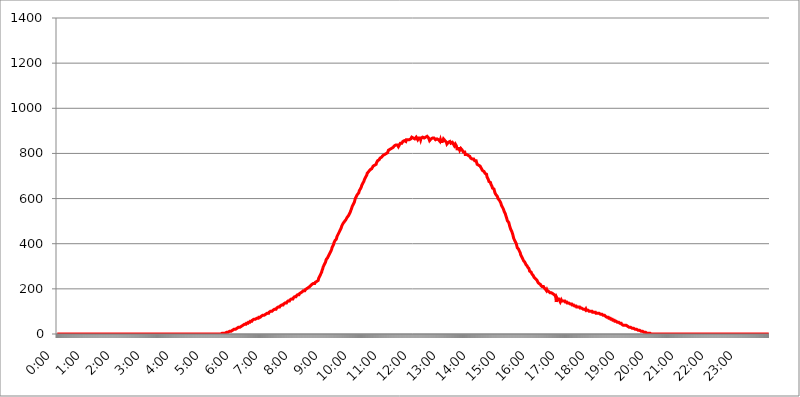
| Category | 2017.08.09. Intenzitás [W/m^2] |
|---|---|
| 0.0 | 0 |
| 0.0006944444444444445 | 0 |
| 0.001388888888888889 | 0 |
| 0.0020833333333333333 | 0 |
| 0.002777777777777778 | 0 |
| 0.003472222222222222 | 0 |
| 0.004166666666666667 | 0 |
| 0.004861111111111111 | 0 |
| 0.005555555555555556 | 0 |
| 0.0062499999999999995 | 0 |
| 0.006944444444444444 | 0 |
| 0.007638888888888889 | 0 |
| 0.008333333333333333 | 0 |
| 0.009027777777777779 | 0 |
| 0.009722222222222222 | 0 |
| 0.010416666666666666 | 0 |
| 0.011111111111111112 | 0 |
| 0.011805555555555555 | 0 |
| 0.012499999999999999 | 0 |
| 0.013194444444444444 | 0 |
| 0.013888888888888888 | 0 |
| 0.014583333333333332 | 0 |
| 0.015277777777777777 | 0 |
| 0.015972222222222224 | 0 |
| 0.016666666666666666 | 0 |
| 0.017361111111111112 | 0 |
| 0.018055555555555557 | 0 |
| 0.01875 | 0 |
| 0.019444444444444445 | 0 |
| 0.02013888888888889 | 0 |
| 0.020833333333333332 | 0 |
| 0.02152777777777778 | 0 |
| 0.022222222222222223 | 0 |
| 0.02291666666666667 | 0 |
| 0.02361111111111111 | 0 |
| 0.024305555555555556 | 0 |
| 0.024999999999999998 | 0 |
| 0.025694444444444447 | 0 |
| 0.02638888888888889 | 0 |
| 0.027083333333333334 | 0 |
| 0.027777777777777776 | 0 |
| 0.02847222222222222 | 0 |
| 0.029166666666666664 | 0 |
| 0.029861111111111113 | 0 |
| 0.030555555555555555 | 0 |
| 0.03125 | 0 |
| 0.03194444444444445 | 0 |
| 0.03263888888888889 | 0 |
| 0.03333333333333333 | 0 |
| 0.034027777777777775 | 0 |
| 0.034722222222222224 | 0 |
| 0.035416666666666666 | 0 |
| 0.036111111111111115 | 0 |
| 0.03680555555555556 | 0 |
| 0.0375 | 0 |
| 0.03819444444444444 | 0 |
| 0.03888888888888889 | 0 |
| 0.03958333333333333 | 0 |
| 0.04027777777777778 | 0 |
| 0.04097222222222222 | 0 |
| 0.041666666666666664 | 0 |
| 0.042361111111111106 | 0 |
| 0.04305555555555556 | 0 |
| 0.043750000000000004 | 0 |
| 0.044444444444444446 | 0 |
| 0.04513888888888889 | 0 |
| 0.04583333333333334 | 0 |
| 0.04652777777777778 | 0 |
| 0.04722222222222222 | 0 |
| 0.04791666666666666 | 0 |
| 0.04861111111111111 | 0 |
| 0.049305555555555554 | 0 |
| 0.049999999999999996 | 0 |
| 0.05069444444444445 | 0 |
| 0.051388888888888894 | 0 |
| 0.052083333333333336 | 0 |
| 0.05277777777777778 | 0 |
| 0.05347222222222222 | 0 |
| 0.05416666666666667 | 0 |
| 0.05486111111111111 | 0 |
| 0.05555555555555555 | 0 |
| 0.05625 | 0 |
| 0.05694444444444444 | 0 |
| 0.057638888888888885 | 0 |
| 0.05833333333333333 | 0 |
| 0.05902777777777778 | 0 |
| 0.059722222222222225 | 0 |
| 0.06041666666666667 | 0 |
| 0.061111111111111116 | 0 |
| 0.06180555555555556 | 0 |
| 0.0625 | 0 |
| 0.06319444444444444 | 0 |
| 0.06388888888888888 | 0 |
| 0.06458333333333334 | 0 |
| 0.06527777777777778 | 0 |
| 0.06597222222222222 | 0 |
| 0.06666666666666667 | 0 |
| 0.06736111111111111 | 0 |
| 0.06805555555555555 | 0 |
| 0.06874999999999999 | 0 |
| 0.06944444444444443 | 0 |
| 0.07013888888888889 | 0 |
| 0.07083333333333333 | 0 |
| 0.07152777777777779 | 0 |
| 0.07222222222222223 | 0 |
| 0.07291666666666667 | 0 |
| 0.07361111111111111 | 0 |
| 0.07430555555555556 | 0 |
| 0.075 | 0 |
| 0.07569444444444444 | 0 |
| 0.0763888888888889 | 0 |
| 0.07708333333333334 | 0 |
| 0.07777777777777778 | 0 |
| 0.07847222222222222 | 0 |
| 0.07916666666666666 | 0 |
| 0.0798611111111111 | 0 |
| 0.08055555555555556 | 0 |
| 0.08125 | 0 |
| 0.08194444444444444 | 0 |
| 0.08263888888888889 | 0 |
| 0.08333333333333333 | 0 |
| 0.08402777777777777 | 0 |
| 0.08472222222222221 | 0 |
| 0.08541666666666665 | 0 |
| 0.08611111111111112 | 0 |
| 0.08680555555555557 | 0 |
| 0.08750000000000001 | 0 |
| 0.08819444444444445 | 0 |
| 0.08888888888888889 | 0 |
| 0.08958333333333333 | 0 |
| 0.09027777777777778 | 0 |
| 0.09097222222222222 | 0 |
| 0.09166666666666667 | 0 |
| 0.09236111111111112 | 0 |
| 0.09305555555555556 | 0 |
| 0.09375 | 0 |
| 0.09444444444444444 | 0 |
| 0.09513888888888888 | 0 |
| 0.09583333333333333 | 0 |
| 0.09652777777777777 | 0 |
| 0.09722222222222222 | 0 |
| 0.09791666666666667 | 0 |
| 0.09861111111111111 | 0 |
| 0.09930555555555555 | 0 |
| 0.09999999999999999 | 0 |
| 0.10069444444444443 | 0 |
| 0.1013888888888889 | 0 |
| 0.10208333333333335 | 0 |
| 0.10277777777777779 | 0 |
| 0.10347222222222223 | 0 |
| 0.10416666666666667 | 0 |
| 0.10486111111111111 | 0 |
| 0.10555555555555556 | 0 |
| 0.10625 | 0 |
| 0.10694444444444444 | 0 |
| 0.1076388888888889 | 0 |
| 0.10833333333333334 | 0 |
| 0.10902777777777778 | 0 |
| 0.10972222222222222 | 0 |
| 0.1111111111111111 | 0 |
| 0.11180555555555556 | 0 |
| 0.11180555555555556 | 0 |
| 0.1125 | 0 |
| 0.11319444444444444 | 0 |
| 0.11388888888888889 | 0 |
| 0.11458333333333333 | 0 |
| 0.11527777777777777 | 0 |
| 0.11597222222222221 | 0 |
| 0.11666666666666665 | 0 |
| 0.1173611111111111 | 0 |
| 0.11805555555555557 | 0 |
| 0.11944444444444445 | 0 |
| 0.12013888888888889 | 0 |
| 0.12083333333333333 | 0 |
| 0.12152777777777778 | 0 |
| 0.12222222222222223 | 0 |
| 0.12291666666666667 | 0 |
| 0.12291666666666667 | 0 |
| 0.12361111111111112 | 0 |
| 0.12430555555555556 | 0 |
| 0.125 | 0 |
| 0.12569444444444444 | 0 |
| 0.12638888888888888 | 0 |
| 0.12708333333333333 | 0 |
| 0.16875 | 0 |
| 0.12847222222222224 | 0 |
| 0.12916666666666668 | 0 |
| 0.12986111111111112 | 0 |
| 0.13055555555555556 | 0 |
| 0.13125 | 0 |
| 0.13194444444444445 | 0 |
| 0.1326388888888889 | 0 |
| 0.13333333333333333 | 0 |
| 0.13402777777777777 | 0 |
| 0.13402777777777777 | 0 |
| 0.13472222222222222 | 0 |
| 0.13541666666666666 | 0 |
| 0.1361111111111111 | 0 |
| 0.13749999999999998 | 0 |
| 0.13819444444444443 | 0 |
| 0.1388888888888889 | 0 |
| 0.13958333333333334 | 0 |
| 0.14027777777777778 | 0 |
| 0.14097222222222222 | 0 |
| 0.14166666666666666 | 0 |
| 0.1423611111111111 | 0 |
| 0.14305555555555557 | 0 |
| 0.14375000000000002 | 0 |
| 0.14444444444444446 | 0 |
| 0.1451388888888889 | 0 |
| 0.1451388888888889 | 0 |
| 0.14652777777777778 | 0 |
| 0.14722222222222223 | 0 |
| 0.14791666666666667 | 0 |
| 0.1486111111111111 | 0 |
| 0.14930555555555555 | 0 |
| 0.15 | 0 |
| 0.15069444444444444 | 0 |
| 0.15138888888888888 | 0 |
| 0.15208333333333332 | 0 |
| 0.15277777777777776 | 0 |
| 0.15347222222222223 | 0 |
| 0.15416666666666667 | 0 |
| 0.15486111111111112 | 0 |
| 0.15555555555555556 | 0 |
| 0.15625 | 0 |
| 0.15694444444444444 | 0 |
| 0.15763888888888888 | 0 |
| 0.15833333333333333 | 0 |
| 0.15902777777777777 | 0 |
| 0.15972222222222224 | 0 |
| 0.16041666666666668 | 0 |
| 0.16111111111111112 | 0 |
| 0.16180555555555556 | 0 |
| 0.1625 | 0 |
| 0.16319444444444445 | 0 |
| 0.1638888888888889 | 0 |
| 0.16458333333333333 | 0 |
| 0.16527777777777777 | 0 |
| 0.16597222222222222 | 0 |
| 0.16666666666666666 | 0 |
| 0.1673611111111111 | 0 |
| 0.16805555555555554 | 0 |
| 0.16874999999999998 | 0 |
| 0.16944444444444443 | 0 |
| 0.17013888888888887 | 0 |
| 0.1708333333333333 | 0 |
| 0.17152777777777775 | 0 |
| 0.17222222222222225 | 0 |
| 0.1729166666666667 | 0 |
| 0.17361111111111113 | 0 |
| 0.17430555555555557 | 0 |
| 0.17500000000000002 | 0 |
| 0.17569444444444446 | 0 |
| 0.1763888888888889 | 0 |
| 0.17708333333333334 | 0 |
| 0.17777777777777778 | 0 |
| 0.17847222222222223 | 0 |
| 0.17916666666666667 | 0 |
| 0.1798611111111111 | 0 |
| 0.18055555555555555 | 0 |
| 0.18125 | 0 |
| 0.18194444444444444 | 0 |
| 0.1826388888888889 | 0 |
| 0.18333333333333335 | 0 |
| 0.1840277777777778 | 0 |
| 0.18472222222222223 | 0 |
| 0.18541666666666667 | 0 |
| 0.18611111111111112 | 0 |
| 0.18680555555555556 | 0 |
| 0.1875 | 0 |
| 0.18819444444444444 | 0 |
| 0.18888888888888888 | 0 |
| 0.18958333333333333 | 0 |
| 0.19027777777777777 | 0 |
| 0.1909722222222222 | 0 |
| 0.19166666666666665 | 0 |
| 0.19236111111111112 | 0 |
| 0.19305555555555554 | 0 |
| 0.19375 | 0 |
| 0.19444444444444445 | 0 |
| 0.1951388888888889 | 0 |
| 0.19583333333333333 | 0 |
| 0.19652777777777777 | 0 |
| 0.19722222222222222 | 0 |
| 0.19791666666666666 | 0 |
| 0.1986111111111111 | 0 |
| 0.19930555555555554 | 0 |
| 0.19999999999999998 | 0 |
| 0.20069444444444443 | 0 |
| 0.20138888888888887 | 0 |
| 0.2020833333333333 | 0 |
| 0.2027777777777778 | 0 |
| 0.2034722222222222 | 0 |
| 0.2041666666666667 | 0 |
| 0.20486111111111113 | 0 |
| 0.20555555555555557 | 0 |
| 0.20625000000000002 | 0 |
| 0.20694444444444446 | 0 |
| 0.2076388888888889 | 0 |
| 0.20833333333333334 | 0 |
| 0.20902777777777778 | 0 |
| 0.20972222222222223 | 0 |
| 0.21041666666666667 | 0 |
| 0.2111111111111111 | 0 |
| 0.21180555555555555 | 0 |
| 0.2125 | 0 |
| 0.21319444444444444 | 0 |
| 0.2138888888888889 | 0 |
| 0.21458333333333335 | 0 |
| 0.2152777777777778 | 0 |
| 0.21597222222222223 | 0 |
| 0.21666666666666667 | 0 |
| 0.21736111111111112 | 0 |
| 0.21805555555555556 | 0 |
| 0.21875 | 0 |
| 0.21944444444444444 | 0 |
| 0.22013888888888888 | 0 |
| 0.22083333333333333 | 0 |
| 0.22152777777777777 | 0 |
| 0.2222222222222222 | 0 |
| 0.22291666666666665 | 0 |
| 0.2236111111111111 | 0 |
| 0.22430555555555556 | 0 |
| 0.225 | 0 |
| 0.22569444444444445 | 0 |
| 0.2263888888888889 | 0 |
| 0.22708333333333333 | 0 |
| 0.22777777777777777 | 0 |
| 0.22847222222222222 | 0 |
| 0.22916666666666666 | 0 |
| 0.2298611111111111 | 0 |
| 0.23055555555555554 | 3.525 |
| 0.23124999999999998 | 3.525 |
| 0.23194444444444443 | 3.525 |
| 0.23263888888888887 | 3.525 |
| 0.2333333333333333 | 3.525 |
| 0.2340277777777778 | 3.525 |
| 0.2347222222222222 | 3.525 |
| 0.2354166666666667 | 3.525 |
| 0.23611111111111113 | 3.525 |
| 0.23680555555555557 | 3.525 |
| 0.23750000000000002 | 7.887 |
| 0.23819444444444446 | 7.887 |
| 0.2388888888888889 | 7.887 |
| 0.23958333333333334 | 7.887 |
| 0.24027777777777778 | 7.887 |
| 0.24097222222222223 | 12.257 |
| 0.24166666666666667 | 12.257 |
| 0.2423611111111111 | 12.257 |
| 0.24305555555555555 | 12.257 |
| 0.24375 | 12.257 |
| 0.24444444444444446 | 12.257 |
| 0.24513888888888888 | 16.636 |
| 0.24583333333333335 | 16.636 |
| 0.2465277777777778 | 16.636 |
| 0.24722222222222223 | 16.636 |
| 0.24791666666666667 | 21.024 |
| 0.24861111111111112 | 21.024 |
| 0.24930555555555556 | 21.024 |
| 0.25 | 21.024 |
| 0.25069444444444444 | 21.024 |
| 0.2513888888888889 | 25.419 |
| 0.2520833333333333 | 25.419 |
| 0.25277777777777777 | 25.419 |
| 0.2534722222222222 | 25.419 |
| 0.25416666666666665 | 29.823 |
| 0.2548611111111111 | 29.823 |
| 0.2555555555555556 | 29.823 |
| 0.25625000000000003 | 29.823 |
| 0.2569444444444445 | 34.234 |
| 0.2576388888888889 | 34.234 |
| 0.25833333333333336 | 34.234 |
| 0.2590277777777778 | 34.234 |
| 0.25972222222222224 | 38.653 |
| 0.2604166666666667 | 38.653 |
| 0.2611111111111111 | 38.653 |
| 0.26180555555555557 | 38.653 |
| 0.2625 | 43.079 |
| 0.26319444444444445 | 43.079 |
| 0.2638888888888889 | 43.079 |
| 0.26458333333333334 | 43.079 |
| 0.2652777777777778 | 47.511 |
| 0.2659722222222222 | 47.511 |
| 0.26666666666666666 | 47.511 |
| 0.2673611111111111 | 47.511 |
| 0.26805555555555555 | 51.951 |
| 0.26875 | 51.951 |
| 0.26944444444444443 | 51.951 |
| 0.2701388888888889 | 51.951 |
| 0.2708333333333333 | 56.398 |
| 0.27152777777777776 | 56.398 |
| 0.2722222222222222 | 56.398 |
| 0.27291666666666664 | 56.398 |
| 0.2736111111111111 | 60.85 |
| 0.2743055555555555 | 60.85 |
| 0.27499999999999997 | 60.85 |
| 0.27569444444444446 | 65.31 |
| 0.27638888888888885 | 65.31 |
| 0.27708333333333335 | 65.31 |
| 0.2777777777777778 | 65.31 |
| 0.27847222222222223 | 65.31 |
| 0.2791666666666667 | 65.31 |
| 0.2798611111111111 | 69.775 |
| 0.28055555555555556 | 69.775 |
| 0.28125 | 69.775 |
| 0.28194444444444444 | 69.775 |
| 0.2826388888888889 | 74.246 |
| 0.2833333333333333 | 74.246 |
| 0.28402777777777777 | 74.246 |
| 0.2847222222222222 | 74.246 |
| 0.28541666666666665 | 74.246 |
| 0.28611111111111115 | 78.722 |
| 0.28680555555555554 | 78.722 |
| 0.28750000000000003 | 78.722 |
| 0.2881944444444445 | 83.205 |
| 0.2888888888888889 | 83.205 |
| 0.28958333333333336 | 83.205 |
| 0.2902777777777778 | 83.205 |
| 0.29097222222222224 | 83.205 |
| 0.2916666666666667 | 83.205 |
| 0.2923611111111111 | 87.692 |
| 0.29305555555555557 | 87.692 |
| 0.29375 | 87.692 |
| 0.29444444444444445 | 92.184 |
| 0.2951388888888889 | 92.184 |
| 0.29583333333333334 | 92.184 |
| 0.2965277777777778 | 92.184 |
| 0.2972222222222222 | 96.682 |
| 0.29791666666666666 | 96.682 |
| 0.2986111111111111 | 96.682 |
| 0.29930555555555555 | 101.184 |
| 0.3 | 101.184 |
| 0.30069444444444443 | 101.184 |
| 0.3013888888888889 | 101.184 |
| 0.3020833333333333 | 101.184 |
| 0.30277777777777776 | 105.69 |
| 0.3034722222222222 | 105.69 |
| 0.30416666666666664 | 105.69 |
| 0.3048611111111111 | 110.201 |
| 0.3055555555555555 | 110.201 |
| 0.30624999999999997 | 110.201 |
| 0.3069444444444444 | 110.201 |
| 0.3076388888888889 | 114.716 |
| 0.30833333333333335 | 114.716 |
| 0.3090277777777778 | 114.716 |
| 0.30972222222222223 | 119.235 |
| 0.3104166666666667 | 119.235 |
| 0.3111111111111111 | 119.235 |
| 0.31180555555555556 | 119.235 |
| 0.3125 | 123.758 |
| 0.31319444444444444 | 123.758 |
| 0.3138888888888889 | 123.758 |
| 0.3145833333333333 | 128.284 |
| 0.31527777777777777 | 128.284 |
| 0.3159722222222222 | 128.284 |
| 0.31666666666666665 | 128.284 |
| 0.31736111111111115 | 132.814 |
| 0.31805555555555554 | 132.814 |
| 0.31875000000000003 | 132.814 |
| 0.3194444444444445 | 137.347 |
| 0.3201388888888889 | 137.347 |
| 0.32083333333333336 | 137.347 |
| 0.3215277777777778 | 137.347 |
| 0.32222222222222224 | 141.884 |
| 0.3229166666666667 | 141.884 |
| 0.3236111111111111 | 146.423 |
| 0.32430555555555557 | 146.423 |
| 0.325 | 146.423 |
| 0.32569444444444445 | 146.423 |
| 0.3263888888888889 | 150.964 |
| 0.32708333333333334 | 150.964 |
| 0.3277777777777778 | 150.964 |
| 0.3284722222222222 | 155.509 |
| 0.32916666666666666 | 155.509 |
| 0.3298611111111111 | 155.509 |
| 0.33055555555555555 | 155.509 |
| 0.33125 | 160.056 |
| 0.33194444444444443 | 160.056 |
| 0.3326388888888889 | 164.605 |
| 0.3333333333333333 | 164.605 |
| 0.3340277777777778 | 164.605 |
| 0.3347222222222222 | 164.605 |
| 0.3354166666666667 | 169.156 |
| 0.3361111111111111 | 169.156 |
| 0.3368055555555556 | 173.709 |
| 0.33749999999999997 | 173.709 |
| 0.33819444444444446 | 173.709 |
| 0.33888888888888885 | 173.709 |
| 0.33958333333333335 | 178.264 |
| 0.34027777777777773 | 178.264 |
| 0.34097222222222223 | 178.264 |
| 0.3416666666666666 | 182.82 |
| 0.3423611111111111 | 182.82 |
| 0.3430555555555555 | 182.82 |
| 0.34375 | 187.378 |
| 0.3444444444444445 | 187.378 |
| 0.3451388888888889 | 191.937 |
| 0.3458333333333334 | 191.937 |
| 0.34652777777777777 | 191.937 |
| 0.34722222222222227 | 191.937 |
| 0.34791666666666665 | 196.497 |
| 0.34861111111111115 | 196.497 |
| 0.34930555555555554 | 196.497 |
| 0.35000000000000003 | 201.058 |
| 0.3506944444444444 | 201.058 |
| 0.3513888888888889 | 201.058 |
| 0.3520833333333333 | 205.62 |
| 0.3527777777777778 | 205.62 |
| 0.3534722222222222 | 205.62 |
| 0.3541666666666667 | 210.182 |
| 0.3548611111111111 | 210.182 |
| 0.35555555555555557 | 214.746 |
| 0.35625 | 214.746 |
| 0.35694444444444445 | 219.309 |
| 0.3576388888888889 | 219.309 |
| 0.35833333333333334 | 219.309 |
| 0.3590277777777778 | 223.873 |
| 0.3597222222222222 | 223.873 |
| 0.36041666666666666 | 223.873 |
| 0.3611111111111111 | 223.873 |
| 0.36180555555555555 | 228.436 |
| 0.3625 | 228.436 |
| 0.36319444444444443 | 228.436 |
| 0.3638888888888889 | 233 |
| 0.3645833333333333 | 233 |
| 0.3652777777777778 | 233 |
| 0.3659722222222222 | 237.564 |
| 0.3666666666666667 | 246.689 |
| 0.3673611111111111 | 251.251 |
| 0.3680555555555556 | 255.813 |
| 0.36874999999999997 | 260.373 |
| 0.36944444444444446 | 264.932 |
| 0.37013888888888885 | 269.49 |
| 0.37083333333333335 | 274.047 |
| 0.37152777777777773 | 283.156 |
| 0.37222222222222223 | 287.709 |
| 0.3729166666666666 | 296.808 |
| 0.3736111111111111 | 301.354 |
| 0.3743055555555555 | 305.898 |
| 0.375 | 310.44 |
| 0.3756944444444445 | 314.98 |
| 0.3763888888888889 | 319.517 |
| 0.3770833333333334 | 328.584 |
| 0.37777777777777777 | 333.113 |
| 0.37847222222222227 | 333.113 |
| 0.37916666666666665 | 337.639 |
| 0.37986111111111115 | 342.162 |
| 0.38055555555555554 | 346.682 |
| 0.38125000000000003 | 351.198 |
| 0.3819444444444444 | 355.712 |
| 0.3826388888888889 | 360.221 |
| 0.3833333333333333 | 364.728 |
| 0.3840277777777778 | 369.23 |
| 0.3847222222222222 | 373.729 |
| 0.3854166666666667 | 382.715 |
| 0.3861111111111111 | 387.202 |
| 0.38680555555555557 | 391.685 |
| 0.3875 | 396.164 |
| 0.38819444444444445 | 405.108 |
| 0.3888888888888889 | 409.574 |
| 0.38958333333333334 | 414.035 |
| 0.3902777777777778 | 414.035 |
| 0.3909722222222222 | 418.492 |
| 0.39166666666666666 | 422.943 |
| 0.3923611111111111 | 431.833 |
| 0.39305555555555555 | 436.27 |
| 0.39375 | 440.702 |
| 0.39444444444444443 | 445.129 |
| 0.3951388888888889 | 449.551 |
| 0.3958333333333333 | 453.968 |
| 0.3965277777777778 | 458.38 |
| 0.3972222222222222 | 462.786 |
| 0.3979166666666667 | 467.187 |
| 0.3986111111111111 | 471.582 |
| 0.3993055555555556 | 480.356 |
| 0.39999999999999997 | 484.735 |
| 0.40069444444444446 | 489.108 |
| 0.40138888888888885 | 489.108 |
| 0.40208333333333335 | 493.475 |
| 0.40277777777777773 | 497.836 |
| 0.40347222222222223 | 497.836 |
| 0.4041666666666666 | 502.192 |
| 0.4048611111111111 | 506.542 |
| 0.4055555555555555 | 506.542 |
| 0.40625 | 515.223 |
| 0.4069444444444445 | 519.555 |
| 0.4076388888888889 | 519.555 |
| 0.4083333333333334 | 523.88 |
| 0.40902777777777777 | 528.2 |
| 0.40972222222222227 | 532.513 |
| 0.41041666666666665 | 536.82 |
| 0.41111111111111115 | 541.121 |
| 0.41180555555555554 | 545.416 |
| 0.41250000000000003 | 553.986 |
| 0.4131944444444444 | 558.261 |
| 0.4138888888888889 | 566.793 |
| 0.4145833333333333 | 571.049 |
| 0.4152777777777778 | 575.299 |
| 0.4159722222222222 | 579.542 |
| 0.4166666666666667 | 583.779 |
| 0.4173611111111111 | 592.233 |
| 0.41805555555555557 | 600.661 |
| 0.41875 | 604.864 |
| 0.41944444444444445 | 609.062 |
| 0.4201388888888889 | 613.252 |
| 0.42083333333333334 | 617.436 |
| 0.4215277777777778 | 621.613 |
| 0.4222222222222222 | 621.613 |
| 0.42291666666666666 | 625.784 |
| 0.4236111111111111 | 634.105 |
| 0.42430555555555555 | 638.256 |
| 0.425 | 642.4 |
| 0.42569444444444443 | 646.537 |
| 0.4263888888888889 | 650.667 |
| 0.4270833333333333 | 658.909 |
| 0.4277777777777778 | 663.019 |
| 0.4284722222222222 | 667.123 |
| 0.4291666666666667 | 671.22 |
| 0.4298611111111111 | 675.311 |
| 0.4305555555555556 | 679.395 |
| 0.43124999999999997 | 687.544 |
| 0.43194444444444446 | 691.608 |
| 0.43263888888888885 | 695.666 |
| 0.43333333333333335 | 699.717 |
| 0.43402777777777773 | 703.762 |
| 0.43472222222222223 | 711.832 |
| 0.4354166666666666 | 711.832 |
| 0.4361111111111111 | 715.858 |
| 0.4368055555555555 | 719.877 |
| 0.4375 | 719.877 |
| 0.4381944444444445 | 723.889 |
| 0.4388888888888889 | 727.896 |
| 0.4395833333333334 | 727.896 |
| 0.44027777777777777 | 727.896 |
| 0.44097222222222227 | 731.896 |
| 0.44166666666666665 | 735.89 |
| 0.44236111111111115 | 735.89 |
| 0.44305555555555554 | 743.859 |
| 0.44375000000000003 | 743.859 |
| 0.4444444444444444 | 747.834 |
| 0.4451388888888889 | 747.834 |
| 0.4458333333333333 | 747.834 |
| 0.4465277777777778 | 751.803 |
| 0.4472222222222222 | 751.803 |
| 0.4479166666666667 | 759.723 |
| 0.4486111111111111 | 763.674 |
| 0.44930555555555557 | 767.62 |
| 0.45 | 767.62 |
| 0.45069444444444445 | 771.559 |
| 0.4513888888888889 | 771.559 |
| 0.45208333333333334 | 775.492 |
| 0.4527777777777778 | 779.42 |
| 0.4534722222222222 | 779.42 |
| 0.45416666666666666 | 775.492 |
| 0.4548611111111111 | 783.342 |
| 0.45555555555555555 | 787.258 |
| 0.45625 | 787.258 |
| 0.45694444444444443 | 791.169 |
| 0.4576388888888889 | 791.169 |
| 0.4583333333333333 | 791.169 |
| 0.4590277777777778 | 795.074 |
| 0.4597222222222222 | 798.974 |
| 0.4604166666666667 | 795.074 |
| 0.4611111111111111 | 798.974 |
| 0.4618055555555556 | 802.868 |
| 0.46249999999999997 | 802.868 |
| 0.46319444444444446 | 802.868 |
| 0.46388888888888885 | 806.757 |
| 0.46458333333333335 | 814.519 |
| 0.46527777777777773 | 814.519 |
| 0.46597222222222223 | 814.519 |
| 0.4666666666666666 | 818.392 |
| 0.4673611111111111 | 818.392 |
| 0.4680555555555555 | 822.26 |
| 0.46875 | 822.26 |
| 0.4694444444444445 | 822.26 |
| 0.4701388888888889 | 826.123 |
| 0.4708333333333334 | 826.123 |
| 0.47152777777777777 | 829.981 |
| 0.47222222222222227 | 829.981 |
| 0.47291666666666665 | 833.834 |
| 0.47361111111111115 | 829.981 |
| 0.47430555555555554 | 837.682 |
| 0.47500000000000003 | 837.682 |
| 0.4756944444444444 | 837.682 |
| 0.4763888888888889 | 837.682 |
| 0.4770833333333333 | 837.682 |
| 0.4777777777777778 | 833.834 |
| 0.4784722222222222 | 829.981 |
| 0.4791666666666667 | 829.981 |
| 0.4798611111111111 | 837.682 |
| 0.48055555555555557 | 841.526 |
| 0.48125 | 845.365 |
| 0.48194444444444445 | 849.199 |
| 0.4826388888888889 | 849.199 |
| 0.48333333333333334 | 845.365 |
| 0.4840277777777778 | 845.365 |
| 0.4847222222222222 | 853.029 |
| 0.48541666666666666 | 853.029 |
| 0.4861111111111111 | 856.855 |
| 0.48680555555555555 | 856.855 |
| 0.4875 | 856.855 |
| 0.48819444444444443 | 856.855 |
| 0.4888888888888889 | 853.029 |
| 0.4895833333333333 | 860.676 |
| 0.4902777777777778 | 856.855 |
| 0.4909722222222222 | 856.855 |
| 0.4916666666666667 | 860.676 |
| 0.4923611111111111 | 860.676 |
| 0.4930555555555556 | 860.676 |
| 0.49374999999999997 | 860.676 |
| 0.49444444444444446 | 860.676 |
| 0.49513888888888885 | 864.493 |
| 0.49583333333333335 | 864.493 |
| 0.49652777777777773 | 860.676 |
| 0.49722222222222223 | 872.114 |
| 0.4979166666666666 | 868.305 |
| 0.4986111111111111 | 868.305 |
| 0.4993055555555555 | 868.305 |
| 0.5 | 868.305 |
| 0.5006944444444444 | 864.493 |
| 0.5013888888888889 | 864.493 |
| 0.5020833333333333 | 868.305 |
| 0.5027777777777778 | 868.305 |
| 0.5034722222222222 | 872.114 |
| 0.5041666666666667 | 872.114 |
| 0.5048611111111111 | 868.305 |
| 0.5055555555555555 | 860.676 |
| 0.50625 | 864.493 |
| 0.5069444444444444 | 868.305 |
| 0.5076388888888889 | 864.493 |
| 0.5083333333333333 | 868.305 |
| 0.5090277777777777 | 868.305 |
| 0.5097222222222222 | 860.676 |
| 0.5104166666666666 | 868.305 |
| 0.5111111111111112 | 868.305 |
| 0.5118055555555555 | 868.305 |
| 0.5125000000000001 | 872.114 |
| 0.5131944444444444 | 868.305 |
| 0.513888888888889 | 868.305 |
| 0.5145833333333333 | 868.305 |
| 0.5152777777777778 | 868.305 |
| 0.5159722222222222 | 868.305 |
| 0.5166666666666667 | 872.114 |
| 0.517361111111111 | 872.114 |
| 0.5180555555555556 | 875.918 |
| 0.5187499999999999 | 875.918 |
| 0.5194444444444445 | 875.918 |
| 0.5201388888888888 | 872.114 |
| 0.5208333333333334 | 868.305 |
| 0.5215277777777778 | 872.114 |
| 0.5222222222222223 | 856.855 |
| 0.5229166666666667 | 856.855 |
| 0.5236111111111111 | 856.855 |
| 0.5243055555555556 | 864.493 |
| 0.525 | 864.493 |
| 0.5256944444444445 | 868.305 |
| 0.5263888888888889 | 868.305 |
| 0.5270833333333333 | 872.114 |
| 0.5277777777777778 | 864.493 |
| 0.5284722222222222 | 868.305 |
| 0.5291666666666667 | 868.305 |
| 0.5298611111111111 | 864.493 |
| 0.5305555555555556 | 860.676 |
| 0.53125 | 860.676 |
| 0.5319444444444444 | 864.493 |
| 0.5326388888888889 | 864.493 |
| 0.5333333333333333 | 868.305 |
| 0.5340277777777778 | 860.676 |
| 0.5347222222222222 | 860.676 |
| 0.5354166666666667 | 860.676 |
| 0.5361111111111111 | 860.676 |
| 0.5368055555555555 | 853.029 |
| 0.5375 | 860.676 |
| 0.5381944444444444 | 853.029 |
| 0.5388888888888889 | 853.029 |
| 0.5395833333333333 | 853.029 |
| 0.5402777777777777 | 853.029 |
| 0.5409722222222222 | 856.855 |
| 0.5416666666666666 | 864.493 |
| 0.5423611111111112 | 868.305 |
| 0.5430555555555555 | 864.493 |
| 0.5437500000000001 | 856.855 |
| 0.5444444444444444 | 856.855 |
| 0.545138888888889 | 853.029 |
| 0.5458333333333333 | 849.199 |
| 0.5465277777777778 | 841.526 |
| 0.5472222222222222 | 845.365 |
| 0.5479166666666667 | 845.365 |
| 0.548611111111111 | 849.199 |
| 0.5493055555555556 | 853.029 |
| 0.5499999999999999 | 853.029 |
| 0.5506944444444445 | 853.029 |
| 0.5513888888888888 | 849.199 |
| 0.5520833333333334 | 845.365 |
| 0.5527777777777778 | 849.199 |
| 0.5534722222222223 | 849.199 |
| 0.5541666666666667 | 849.199 |
| 0.5548611111111111 | 845.365 |
| 0.5555555555555556 | 841.526 |
| 0.55625 | 845.365 |
| 0.5569444444444445 | 833.834 |
| 0.5576388888888889 | 837.682 |
| 0.5583333333333333 | 841.526 |
| 0.5590277777777778 | 841.526 |
| 0.5597222222222222 | 833.834 |
| 0.5604166666666667 | 833.834 |
| 0.5611111111111111 | 814.519 |
| 0.5618055555555556 | 822.26 |
| 0.5625 | 826.123 |
| 0.5631944444444444 | 822.26 |
| 0.5638888888888889 | 822.26 |
| 0.5645833333333333 | 814.519 |
| 0.5652777777777778 | 814.519 |
| 0.5659722222222222 | 822.26 |
| 0.5666666666666667 | 822.26 |
| 0.5673611111111111 | 822.26 |
| 0.5680555555555555 | 814.519 |
| 0.56875 | 814.519 |
| 0.5694444444444444 | 806.757 |
| 0.5701388888888889 | 802.868 |
| 0.5708333333333333 | 806.757 |
| 0.5715277777777777 | 806.757 |
| 0.5722222222222222 | 795.074 |
| 0.5729166666666666 | 798.974 |
| 0.5736111111111112 | 791.169 |
| 0.5743055555555555 | 795.074 |
| 0.5750000000000001 | 791.169 |
| 0.5756944444444444 | 795.074 |
| 0.576388888888889 | 791.169 |
| 0.5770833333333333 | 787.258 |
| 0.5777777777777778 | 787.258 |
| 0.5784722222222222 | 787.258 |
| 0.5791666666666667 | 783.342 |
| 0.579861111111111 | 779.42 |
| 0.5805555555555556 | 775.492 |
| 0.5812499999999999 | 779.42 |
| 0.5819444444444445 | 775.492 |
| 0.5826388888888888 | 775.492 |
| 0.5833333333333334 | 775.492 |
| 0.5840277777777778 | 775.492 |
| 0.5847222222222223 | 771.559 |
| 0.5854166666666667 | 767.62 |
| 0.5861111111111111 | 763.674 |
| 0.5868055555555556 | 763.674 |
| 0.5875 | 767.62 |
| 0.5881944444444445 | 759.723 |
| 0.5888888888888889 | 751.803 |
| 0.5895833333333333 | 751.803 |
| 0.5902777777777778 | 751.803 |
| 0.5909722222222222 | 747.834 |
| 0.5916666666666667 | 747.834 |
| 0.5923611111111111 | 743.859 |
| 0.5930555555555556 | 743.859 |
| 0.59375 | 739.877 |
| 0.5944444444444444 | 735.89 |
| 0.5951388888888889 | 735.89 |
| 0.5958333333333333 | 731.896 |
| 0.5965277777777778 | 723.889 |
| 0.5972222222222222 | 727.896 |
| 0.5979166666666667 | 719.877 |
| 0.5986111111111111 | 719.877 |
| 0.5993055555555555 | 715.858 |
| 0.6 | 711.832 |
| 0.6006944444444444 | 711.832 |
| 0.6013888888888889 | 707.8 |
| 0.6020833333333333 | 707.8 |
| 0.6027777777777777 | 695.666 |
| 0.6034722222222222 | 691.608 |
| 0.6041666666666666 | 687.544 |
| 0.6048611111111112 | 683.473 |
| 0.6055555555555555 | 675.311 |
| 0.6062500000000001 | 675.311 |
| 0.6069444444444444 | 671.22 |
| 0.607638888888889 | 671.22 |
| 0.6083333333333333 | 663.019 |
| 0.6090277777777778 | 658.909 |
| 0.6097222222222222 | 654.791 |
| 0.6104166666666667 | 646.537 |
| 0.611111111111111 | 646.537 |
| 0.6118055555555556 | 642.4 |
| 0.6124999999999999 | 642.4 |
| 0.6131944444444445 | 634.105 |
| 0.6138888888888888 | 625.784 |
| 0.6145833333333334 | 621.613 |
| 0.6152777777777778 | 617.436 |
| 0.6159722222222223 | 617.436 |
| 0.6166666666666667 | 617.436 |
| 0.6173611111111111 | 609.062 |
| 0.6180555555555556 | 600.661 |
| 0.61875 | 600.661 |
| 0.6194444444444445 | 596.45 |
| 0.6201388888888889 | 592.233 |
| 0.6208333333333333 | 588.009 |
| 0.6215277777777778 | 588.009 |
| 0.6222222222222222 | 579.542 |
| 0.6229166666666667 | 571.049 |
| 0.6236111111111111 | 566.793 |
| 0.6243055555555556 | 562.53 |
| 0.625 | 558.261 |
| 0.6256944444444444 | 553.986 |
| 0.6263888888888889 | 549.704 |
| 0.6270833333333333 | 541.121 |
| 0.6277777777777778 | 536.82 |
| 0.6284722222222222 | 532.513 |
| 0.6291666666666667 | 523.88 |
| 0.6298611111111111 | 519.555 |
| 0.6305555555555555 | 510.885 |
| 0.63125 | 502.192 |
| 0.6319444444444444 | 502.192 |
| 0.6326388888888889 | 497.836 |
| 0.6333333333333333 | 493.475 |
| 0.6340277777777777 | 484.735 |
| 0.6347222222222222 | 475.972 |
| 0.6354166666666666 | 471.582 |
| 0.6361111111111112 | 462.786 |
| 0.6368055555555555 | 458.38 |
| 0.6375000000000001 | 453.968 |
| 0.6381944444444444 | 449.551 |
| 0.638888888888889 | 440.702 |
| 0.6395833333333333 | 431.833 |
| 0.6402777777777778 | 422.943 |
| 0.6409722222222222 | 422.943 |
| 0.6416666666666667 | 414.035 |
| 0.642361111111111 | 409.574 |
| 0.6430555555555556 | 405.108 |
| 0.6437499999999999 | 400.638 |
| 0.6444444444444445 | 391.685 |
| 0.6451388888888888 | 382.715 |
| 0.6458333333333334 | 382.715 |
| 0.6465277777777778 | 378.224 |
| 0.6472222222222223 | 373.729 |
| 0.6479166666666667 | 369.23 |
| 0.6486111111111111 | 364.728 |
| 0.6493055555555556 | 360.221 |
| 0.65 | 351.198 |
| 0.6506944444444445 | 346.682 |
| 0.6513888888888889 | 342.162 |
| 0.6520833333333333 | 337.639 |
| 0.6527777777777778 | 333.113 |
| 0.6534722222222222 | 328.584 |
| 0.6541666666666667 | 324.052 |
| 0.6548611111111111 | 324.052 |
| 0.6555555555555556 | 319.517 |
| 0.65625 | 314.98 |
| 0.6569444444444444 | 310.44 |
| 0.6576388888888889 | 305.898 |
| 0.6583333333333333 | 305.898 |
| 0.6590277777777778 | 301.354 |
| 0.6597222222222222 | 296.808 |
| 0.6604166666666667 | 296.808 |
| 0.6611111111111111 | 292.259 |
| 0.6618055555555555 | 287.709 |
| 0.6625 | 278.603 |
| 0.6631944444444444 | 278.603 |
| 0.6638888888888889 | 278.603 |
| 0.6645833333333333 | 274.047 |
| 0.6652777777777777 | 274.047 |
| 0.6659722222222222 | 264.932 |
| 0.6666666666666666 | 264.932 |
| 0.6673611111111111 | 260.373 |
| 0.6680555555555556 | 255.813 |
| 0.6687500000000001 | 251.251 |
| 0.6694444444444444 | 251.251 |
| 0.6701388888888888 | 246.689 |
| 0.6708333333333334 | 246.689 |
| 0.6715277777777778 | 242.127 |
| 0.6722222222222222 | 242.127 |
| 0.6729166666666666 | 237.564 |
| 0.6736111111111112 | 233 |
| 0.6743055555555556 | 228.436 |
| 0.6749999999999999 | 228.436 |
| 0.6756944444444444 | 223.873 |
| 0.6763888888888889 | 223.873 |
| 0.6770833333333334 | 223.873 |
| 0.6777777777777777 | 219.309 |
| 0.6784722222222223 | 214.746 |
| 0.6791666666666667 | 214.746 |
| 0.6798611111111111 | 210.182 |
| 0.6805555555555555 | 210.182 |
| 0.68125 | 210.182 |
| 0.6819444444444445 | 210.182 |
| 0.6826388888888889 | 205.62 |
| 0.6833333333333332 | 205.62 |
| 0.6840277777777778 | 201.058 |
| 0.6847222222222222 | 201.058 |
| 0.6854166666666667 | 201.058 |
| 0.686111111111111 | 191.937 |
| 0.6868055555555556 | 196.497 |
| 0.6875 | 191.937 |
| 0.6881944444444444 | 191.937 |
| 0.688888888888889 | 191.937 |
| 0.6895833333333333 | 187.378 |
| 0.6902777777777778 | 187.378 |
| 0.6909722222222222 | 182.82 |
| 0.6916666666666668 | 182.82 |
| 0.6923611111111111 | 182.82 |
| 0.6930555555555555 | 182.82 |
| 0.69375 | 182.82 |
| 0.6944444444444445 | 182.82 |
| 0.6951388888888889 | 178.264 |
| 0.6958333333333333 | 178.264 |
| 0.6965277777777777 | 178.264 |
| 0.6972222222222223 | 173.709 |
| 0.6979166666666666 | 173.709 |
| 0.6986111111111111 | 169.156 |
| 0.6993055555555556 | 160.056 |
| 0.7000000000000001 | 141.884 |
| 0.7006944444444444 | 160.056 |
| 0.7013888888888888 | 155.509 |
| 0.7020833333333334 | 155.509 |
| 0.7027777777777778 | 155.509 |
| 0.7034722222222222 | 155.509 |
| 0.7041666666666666 | 155.509 |
| 0.7048611111111112 | 146.423 |
| 0.7055555555555556 | 141.884 |
| 0.7062499999999999 | 146.423 |
| 0.7069444444444444 | 150.964 |
| 0.7076388888888889 | 146.423 |
| 0.7083333333333334 | 146.423 |
| 0.7090277777777777 | 146.423 |
| 0.7097222222222223 | 146.423 |
| 0.7104166666666667 | 146.423 |
| 0.7111111111111111 | 146.423 |
| 0.7118055555555555 | 146.423 |
| 0.7125 | 141.884 |
| 0.7131944444444445 | 141.884 |
| 0.7138888888888889 | 141.884 |
| 0.7145833333333332 | 141.884 |
| 0.7152777777777778 | 137.347 |
| 0.7159722222222222 | 137.347 |
| 0.7166666666666667 | 137.347 |
| 0.717361111111111 | 137.347 |
| 0.7180555555555556 | 137.347 |
| 0.71875 | 137.347 |
| 0.7194444444444444 | 132.814 |
| 0.720138888888889 | 132.814 |
| 0.7208333333333333 | 132.814 |
| 0.7215277777777778 | 132.814 |
| 0.7222222222222222 | 128.284 |
| 0.7229166666666668 | 128.284 |
| 0.7236111111111111 | 128.284 |
| 0.7243055555555555 | 128.284 |
| 0.725 | 128.284 |
| 0.7256944444444445 | 123.758 |
| 0.7263888888888889 | 123.758 |
| 0.7270833333333333 | 123.758 |
| 0.7277777777777777 | 123.758 |
| 0.7284722222222223 | 119.235 |
| 0.7291666666666666 | 119.235 |
| 0.7298611111111111 | 119.235 |
| 0.7305555555555556 | 119.235 |
| 0.7312500000000001 | 119.235 |
| 0.7319444444444444 | 119.235 |
| 0.7326388888888888 | 119.235 |
| 0.7333333333333334 | 114.716 |
| 0.7340277777777778 | 114.716 |
| 0.7347222222222222 | 114.716 |
| 0.7354166666666666 | 114.716 |
| 0.7361111111111112 | 114.716 |
| 0.7368055555555556 | 114.716 |
| 0.7374999999999999 | 110.201 |
| 0.7381944444444444 | 110.201 |
| 0.7388888888888889 | 110.201 |
| 0.7395833333333334 | 110.201 |
| 0.7402777777777777 | 110.201 |
| 0.7409722222222223 | 105.69 |
| 0.7416666666666667 | 110.201 |
| 0.7423611111111111 | 105.69 |
| 0.7430555555555555 | 105.69 |
| 0.74375 | 105.69 |
| 0.7444444444444445 | 105.69 |
| 0.7451388888888889 | 105.69 |
| 0.7458333333333332 | 101.184 |
| 0.7465277777777778 | 101.184 |
| 0.7472222222222222 | 101.184 |
| 0.7479166666666667 | 101.184 |
| 0.748611111111111 | 101.184 |
| 0.7493055555555556 | 101.184 |
| 0.75 | 101.184 |
| 0.7506944444444444 | 96.682 |
| 0.751388888888889 | 96.682 |
| 0.7520833333333333 | 96.682 |
| 0.7527777777777778 | 96.682 |
| 0.7534722222222222 | 96.682 |
| 0.7541666666666668 | 96.682 |
| 0.7548611111111111 | 96.682 |
| 0.7555555555555555 | 92.184 |
| 0.75625 | 92.184 |
| 0.7569444444444445 | 92.184 |
| 0.7576388888888889 | 92.184 |
| 0.7583333333333333 | 92.184 |
| 0.7590277777777777 | 92.184 |
| 0.7597222222222223 | 92.184 |
| 0.7604166666666666 | 92.184 |
| 0.7611111111111111 | 92.184 |
| 0.7618055555555556 | 87.692 |
| 0.7625000000000001 | 87.692 |
| 0.7631944444444444 | 87.692 |
| 0.7638888888888888 | 87.692 |
| 0.7645833333333334 | 87.692 |
| 0.7652777777777778 | 83.205 |
| 0.7659722222222222 | 83.205 |
| 0.7666666666666666 | 83.205 |
| 0.7673611111111112 | 83.205 |
| 0.7680555555555556 | 83.205 |
| 0.7687499999999999 | 78.722 |
| 0.7694444444444444 | 78.722 |
| 0.7701388888888889 | 78.722 |
| 0.7708333333333334 | 74.246 |
| 0.7715277777777777 | 74.246 |
| 0.7722222222222223 | 74.246 |
| 0.7729166666666667 | 74.246 |
| 0.7736111111111111 | 69.775 |
| 0.7743055555555555 | 69.775 |
| 0.775 | 69.775 |
| 0.7756944444444445 | 69.775 |
| 0.7763888888888889 | 65.31 |
| 0.7770833333333332 | 65.31 |
| 0.7777777777777778 | 65.31 |
| 0.7784722222222222 | 65.31 |
| 0.7791666666666667 | 60.85 |
| 0.779861111111111 | 60.85 |
| 0.7805555555555556 | 60.85 |
| 0.78125 | 60.85 |
| 0.7819444444444444 | 56.398 |
| 0.782638888888889 | 56.398 |
| 0.7833333333333333 | 56.398 |
| 0.7840277777777778 | 56.398 |
| 0.7847222222222222 | 56.398 |
| 0.7854166666666668 | 51.951 |
| 0.7861111111111111 | 51.951 |
| 0.7868055555555555 | 51.951 |
| 0.7875 | 51.951 |
| 0.7881944444444445 | 51.951 |
| 0.7888888888888889 | 47.511 |
| 0.7895833333333333 | 47.511 |
| 0.7902777777777777 | 47.511 |
| 0.7909722222222223 | 47.511 |
| 0.7916666666666666 | 43.079 |
| 0.7923611111111111 | 43.079 |
| 0.7930555555555556 | 43.079 |
| 0.7937500000000001 | 38.653 |
| 0.7944444444444444 | 38.653 |
| 0.7951388888888888 | 38.653 |
| 0.7958333333333334 | 38.653 |
| 0.7965277777777778 | 38.653 |
| 0.7972222222222222 | 38.653 |
| 0.7979166666666666 | 38.653 |
| 0.7986111111111112 | 34.234 |
| 0.7993055555555556 | 34.234 |
| 0.7999999999999999 | 34.234 |
| 0.8006944444444444 | 34.234 |
| 0.8013888888888889 | 34.234 |
| 0.8020833333333334 | 29.823 |
| 0.8027777777777777 | 29.823 |
| 0.8034722222222223 | 29.823 |
| 0.8041666666666667 | 29.823 |
| 0.8048611111111111 | 29.823 |
| 0.8055555555555555 | 25.419 |
| 0.80625 | 25.419 |
| 0.8069444444444445 | 25.419 |
| 0.8076388888888889 | 25.419 |
| 0.8083333333333332 | 25.419 |
| 0.8090277777777778 | 21.024 |
| 0.8097222222222222 | 21.024 |
| 0.8104166666666667 | 21.024 |
| 0.811111111111111 | 21.024 |
| 0.8118055555555556 | 21.024 |
| 0.8125 | 21.024 |
| 0.8131944444444444 | 21.024 |
| 0.813888888888889 | 16.636 |
| 0.8145833333333333 | 16.636 |
| 0.8152777777777778 | 16.636 |
| 0.8159722222222222 | 16.636 |
| 0.8166666666666668 | 16.636 |
| 0.8173611111111111 | 12.257 |
| 0.8180555555555555 | 12.257 |
| 0.81875 | 12.257 |
| 0.8194444444444445 | 12.257 |
| 0.8201388888888889 | 12.257 |
| 0.8208333333333333 | 12.257 |
| 0.8215277777777777 | 7.887 |
| 0.8222222222222223 | 7.887 |
| 0.8229166666666666 | 7.887 |
| 0.8236111111111111 | 7.887 |
| 0.8243055555555556 | 7.887 |
| 0.8250000000000001 | 7.887 |
| 0.8256944444444444 | 3.525 |
| 0.8263888888888888 | 3.525 |
| 0.8270833333333334 | 3.525 |
| 0.8277777777777778 | 3.525 |
| 0.8284722222222222 | 3.525 |
| 0.8291666666666666 | 3.525 |
| 0.8298611111111112 | 3.525 |
| 0.8305555555555556 | 3.525 |
| 0.8312499999999999 | 3.525 |
| 0.8319444444444444 | 0 |
| 0.8326388888888889 | 0 |
| 0.8333333333333334 | 0 |
| 0.8340277777777777 | 0 |
| 0.8347222222222223 | 0 |
| 0.8354166666666667 | 0 |
| 0.8361111111111111 | 0 |
| 0.8368055555555555 | 0 |
| 0.8375 | 0 |
| 0.8381944444444445 | 0 |
| 0.8388888888888889 | 0 |
| 0.8395833333333332 | 0 |
| 0.8402777777777778 | 0 |
| 0.8409722222222222 | 0 |
| 0.8416666666666667 | 0 |
| 0.842361111111111 | 0 |
| 0.8430555555555556 | 0 |
| 0.84375 | 0 |
| 0.8444444444444444 | 0 |
| 0.845138888888889 | 0 |
| 0.8458333333333333 | 0 |
| 0.8465277777777778 | 0 |
| 0.8472222222222222 | 0 |
| 0.8479166666666668 | 0 |
| 0.8486111111111111 | 0 |
| 0.8493055555555555 | 0 |
| 0.85 | 0 |
| 0.8506944444444445 | 0 |
| 0.8513888888888889 | 0 |
| 0.8520833333333333 | 0 |
| 0.8527777777777777 | 0 |
| 0.8534722222222223 | 0 |
| 0.8541666666666666 | 0 |
| 0.8548611111111111 | 0 |
| 0.8555555555555556 | 0 |
| 0.8562500000000001 | 0 |
| 0.8569444444444444 | 0 |
| 0.8576388888888888 | 0 |
| 0.8583333333333334 | 0 |
| 0.8590277777777778 | 0 |
| 0.8597222222222222 | 0 |
| 0.8604166666666666 | 0 |
| 0.8611111111111112 | 0 |
| 0.8618055555555556 | 0 |
| 0.8624999999999999 | 0 |
| 0.8631944444444444 | 0 |
| 0.8638888888888889 | 0 |
| 0.8645833333333334 | 0 |
| 0.8652777777777777 | 0 |
| 0.8659722222222223 | 0 |
| 0.8666666666666667 | 0 |
| 0.8673611111111111 | 0 |
| 0.8680555555555555 | 0 |
| 0.86875 | 0 |
| 0.8694444444444445 | 0 |
| 0.8701388888888889 | 0 |
| 0.8708333333333332 | 0 |
| 0.8715277777777778 | 0 |
| 0.8722222222222222 | 0 |
| 0.8729166666666667 | 0 |
| 0.873611111111111 | 0 |
| 0.8743055555555556 | 0 |
| 0.875 | 0 |
| 0.8756944444444444 | 0 |
| 0.876388888888889 | 0 |
| 0.8770833333333333 | 0 |
| 0.8777777777777778 | 0 |
| 0.8784722222222222 | 0 |
| 0.8791666666666668 | 0 |
| 0.8798611111111111 | 0 |
| 0.8805555555555555 | 0 |
| 0.88125 | 0 |
| 0.8819444444444445 | 0 |
| 0.8826388888888889 | 0 |
| 0.8833333333333333 | 0 |
| 0.8840277777777777 | 0 |
| 0.8847222222222223 | 0 |
| 0.8854166666666666 | 0 |
| 0.8861111111111111 | 0 |
| 0.8868055555555556 | 0 |
| 0.8875000000000001 | 0 |
| 0.8881944444444444 | 0 |
| 0.8888888888888888 | 0 |
| 0.8895833333333334 | 0 |
| 0.8902777777777778 | 0 |
| 0.8909722222222222 | 0 |
| 0.8916666666666666 | 0 |
| 0.8923611111111112 | 0 |
| 0.8930555555555556 | 0 |
| 0.8937499999999999 | 0 |
| 0.8944444444444444 | 0 |
| 0.8951388888888889 | 0 |
| 0.8958333333333334 | 0 |
| 0.8965277777777777 | 0 |
| 0.8972222222222223 | 0 |
| 0.8979166666666667 | 0 |
| 0.8986111111111111 | 0 |
| 0.8993055555555555 | 0 |
| 0.9 | 0 |
| 0.9006944444444445 | 0 |
| 0.9013888888888889 | 0 |
| 0.9020833333333332 | 0 |
| 0.9027777777777778 | 0 |
| 0.9034722222222222 | 0 |
| 0.9041666666666667 | 0 |
| 0.904861111111111 | 0 |
| 0.9055555555555556 | 0 |
| 0.90625 | 0 |
| 0.9069444444444444 | 0 |
| 0.907638888888889 | 0 |
| 0.9083333333333333 | 0 |
| 0.9090277777777778 | 0 |
| 0.9097222222222222 | 0 |
| 0.9104166666666668 | 0 |
| 0.9111111111111111 | 0 |
| 0.9118055555555555 | 0 |
| 0.9125 | 0 |
| 0.9131944444444445 | 0 |
| 0.9138888888888889 | 0 |
| 0.9145833333333333 | 0 |
| 0.9152777777777777 | 0 |
| 0.9159722222222223 | 0 |
| 0.9166666666666666 | 0 |
| 0.9173611111111111 | 0 |
| 0.9180555555555556 | 0 |
| 0.9187500000000001 | 0 |
| 0.9194444444444444 | 0 |
| 0.9201388888888888 | 0 |
| 0.9208333333333334 | 0 |
| 0.9215277777777778 | 0 |
| 0.9222222222222222 | 0 |
| 0.9229166666666666 | 0 |
| 0.9236111111111112 | 0 |
| 0.9243055555555556 | 0 |
| 0.9249999999999999 | 0 |
| 0.9256944444444444 | 0 |
| 0.9263888888888889 | 0 |
| 0.9270833333333334 | 0 |
| 0.9277777777777777 | 0 |
| 0.9284722222222223 | 0 |
| 0.9291666666666667 | 0 |
| 0.9298611111111111 | 0 |
| 0.9305555555555555 | 0 |
| 0.93125 | 0 |
| 0.9319444444444445 | 0 |
| 0.9326388888888889 | 0 |
| 0.9333333333333332 | 0 |
| 0.9340277777777778 | 0 |
| 0.9347222222222222 | 0 |
| 0.9354166666666667 | 0 |
| 0.936111111111111 | 0 |
| 0.9368055555555556 | 0 |
| 0.9375 | 0 |
| 0.9381944444444444 | 0 |
| 0.938888888888889 | 0 |
| 0.9395833333333333 | 0 |
| 0.9402777777777778 | 0 |
| 0.9409722222222222 | 0 |
| 0.9416666666666668 | 0 |
| 0.9423611111111111 | 0 |
| 0.9430555555555555 | 0 |
| 0.94375 | 0 |
| 0.9444444444444445 | 0 |
| 0.9451388888888889 | 0 |
| 0.9458333333333333 | 0 |
| 0.9465277777777777 | 0 |
| 0.9472222222222223 | 0 |
| 0.9479166666666666 | 0 |
| 0.9486111111111111 | 0 |
| 0.9493055555555556 | 0 |
| 0.9500000000000001 | 0 |
| 0.9506944444444444 | 0 |
| 0.9513888888888888 | 0 |
| 0.9520833333333334 | 0 |
| 0.9527777777777778 | 0 |
| 0.9534722222222222 | 0 |
| 0.9541666666666666 | 0 |
| 0.9548611111111112 | 0 |
| 0.9555555555555556 | 0 |
| 0.9562499999999999 | 0 |
| 0.9569444444444444 | 0 |
| 0.9576388888888889 | 0 |
| 0.9583333333333334 | 0 |
| 0.9590277777777777 | 0 |
| 0.9597222222222223 | 0 |
| 0.9604166666666667 | 0 |
| 0.9611111111111111 | 0 |
| 0.9618055555555555 | 0 |
| 0.9625 | 0 |
| 0.9631944444444445 | 0 |
| 0.9638888888888889 | 0 |
| 0.9645833333333332 | 0 |
| 0.9652777777777778 | 0 |
| 0.9659722222222222 | 0 |
| 0.9666666666666667 | 0 |
| 0.967361111111111 | 0 |
| 0.9680555555555556 | 0 |
| 0.96875 | 0 |
| 0.9694444444444444 | 0 |
| 0.970138888888889 | 0 |
| 0.9708333333333333 | 0 |
| 0.9715277777777778 | 0 |
| 0.9722222222222222 | 0 |
| 0.9729166666666668 | 0 |
| 0.9736111111111111 | 0 |
| 0.9743055555555555 | 0 |
| 0.975 | 0 |
| 0.9756944444444445 | 0 |
| 0.9763888888888889 | 0 |
| 0.9770833333333333 | 0 |
| 0.9777777777777777 | 0 |
| 0.9784722222222223 | 0 |
| 0.9791666666666666 | 0 |
| 0.9798611111111111 | 0 |
| 0.9805555555555556 | 0 |
| 0.9812500000000001 | 0 |
| 0.9819444444444444 | 0 |
| 0.9826388888888888 | 0 |
| 0.9833333333333334 | 0 |
| 0.9840277777777778 | 0 |
| 0.9847222222222222 | 0 |
| 0.9854166666666666 | 0 |
| 0.9861111111111112 | 0 |
| 0.9868055555555556 | 0 |
| 0.9874999999999999 | 0 |
| 0.9881944444444444 | 0 |
| 0.9888888888888889 | 0 |
| 0.9895833333333334 | 0 |
| 0.9902777777777777 | 0 |
| 0.9909722222222223 | 0 |
| 0.9916666666666667 | 0 |
| 0.9923611111111111 | 0 |
| 0.9930555555555555 | 0 |
| 0.99375 | 0 |
| 0.9944444444444445 | 0 |
| 0.9951388888888889 | 0 |
| 0.9958333333333332 | 0 |
| 0.9965277777777778 | 0 |
| 0.9972222222222222 | 0 |
| 0.9979166666666667 | 0 |
| 0.998611111111111 | 0 |
| 0.9993055555555556 | 0 |